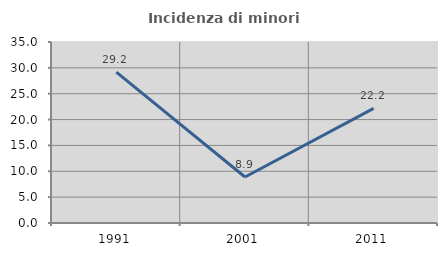
| Category | Incidenza di minori stranieri |
|---|---|
| 1991.0 | 29.167 |
| 2001.0 | 8.889 |
| 2011.0 | 22.156 |